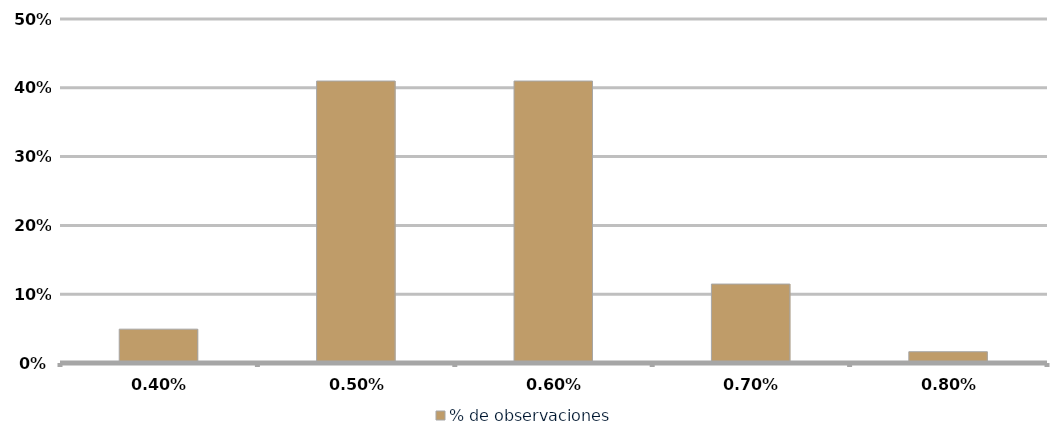
| Category | % de observaciones  |
|---|---|
| 0.004 | 0.049 |
| 0.005 | 0.41 |
| 0.006 | 0.41 |
| 0.007 | 0.115 |
| 0.008 | 0.016 |